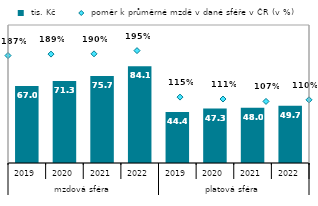
| Category |  tis. Kč |
|---|---|
| 0 | 66.964 |
| 1 | 71.258 |
| 2 | 75.718 |
| 3 | 84.052 |
| 4 | 44.351 |
| 5 | 47.347 |
| 6 | 47.968 |
| 7 | 49.736 |